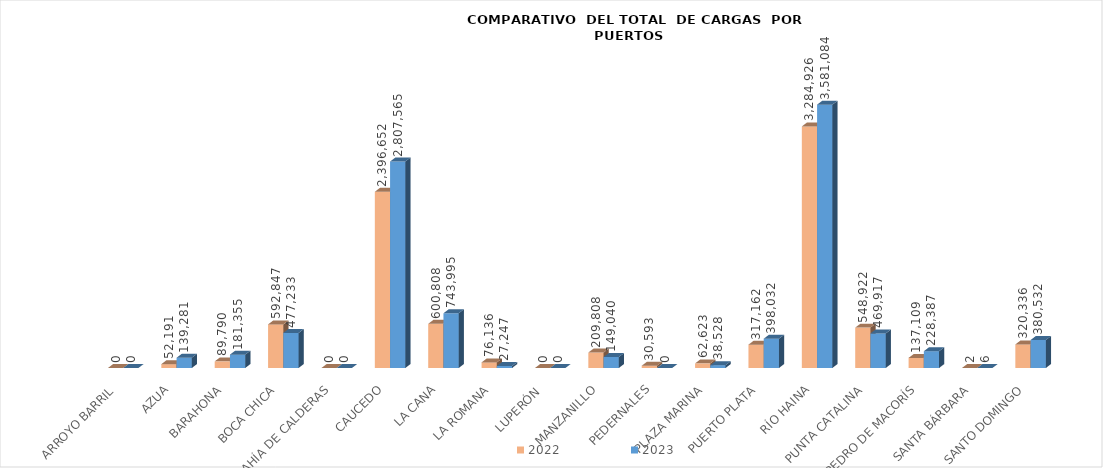
| Category | 2022 | 2023 |
|---|---|---|
| ARROYO BARRIL | 0 | 0 |
| AZUA | 52191 | 139281 |
| BARAHONA | 89790 | 181355 |
| BOCA CHICA | 592847 | 477233 |
| BAHÍA DE CALDERAS | 0 | 0 |
| CAUCEDO | 2396652 | 2807565 |
| LA CANA | 600807.88 | 743995 |
| LA ROMANA | 76136 | 27247 |
| LUPERÓN  | 0 | 0 |
| MANZANILLO | 209808 | 149040 |
| PEDERNALES | 30593 | 0 |
| PLAZA MARINA | 62623 | 38528 |
| PUERTO PLATA | 317162 | 398032 |
| RÍO HAINA | 3284925.53 | 3581084.3 |
| PUNTA CATALINA | 548922 | 469917 |
| SAN PEDRO DE MACORÍS | 137108.75 | 228387 |
| SANTA BÁRBARA | 2 | 6 |
| SANTO DOMINGO | 320336 | 380532 |